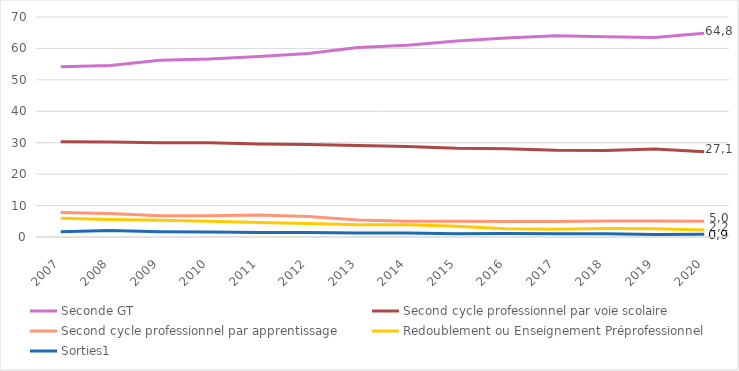
| Category | Seconde GT | Second cycle professionnel par voie scolaire | Second cycle professionnel par apprentissage | Redoublement ou Enseignement Préprofessionnel | Sorties1 |
|---|---|---|---|---|---|
| 2007.0 | 54.2 | 30.3 | 7.8 | 6 | 1.7 |
| 2008.0 | 54.6 | 30.2 | 7.5 | 5.6 | 2.1 |
| 2009.0 | 56.2 | 30 | 6.8 | 5.3 | 1.7 |
| 2010.0 | 56.6 | 30 | 6.8 | 5 | 1.6 |
| 2011.0 | 57.4 | 29.6 | 7 | 4.6 | 1.4 |
| 2012.0 | 58.4 | 29.4 | 6.5 | 4.3 | 1.4 |
| 2013.0 | 60.3 | 29.1 | 5.4 | 3.9 | 1.3 |
| 2014.0 | 61 | 28.8 | 5 | 3.9 | 1.3 |
| 2015.0 | 62.4 | 28.2 | 5 | 3.4 | 1 |
| 2016.0 | 63.3 | 28.1 | 4.9 | 2.6 | 1.1 |
| 2017.0 | 64 | 27.6 | 4.9 | 2.5 | 1 |
| 2018.0 | 63.7 | 27.5 | 5.1 | 2.7 | 1 |
| 2019.0 | 63.5 | 28 | 5.1 | 2.6 | 0.8 |
| 2020.0 | 64.8 | 27.1 | 5 | 2.2 | 0.9 |